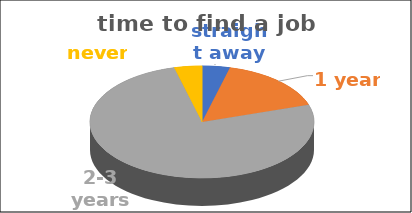
| Category | time to find a job | Series 1 | Series 2 | Series 3 | Series 4 |
|---|---|---|---|---|---|
| straight away | 0.04 |  |  |  |  |
| 1 year | 0.16 |  |  |  |  |
| 2-3 years | 0.76 |  |  |  |  |
| never | 0.04 |  |  |  |  |